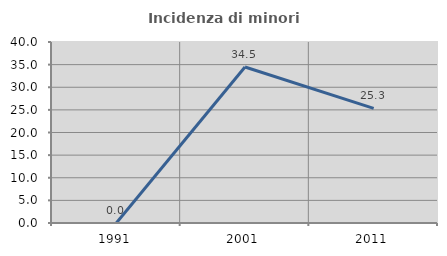
| Category | Incidenza di minori stranieri |
|---|---|
| 1991.0 | 0 |
| 2001.0 | 34.483 |
| 2011.0 | 25.316 |